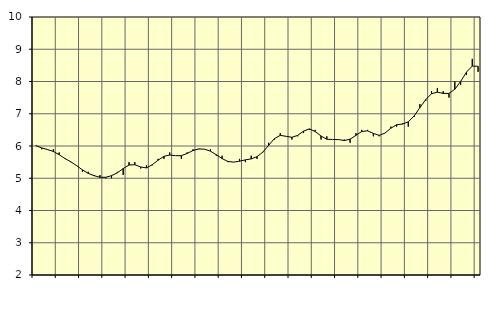
| Category | Piggar | Information och kommunikation, SNI 58-63 |
|---|---|---|
| nan | 6 | 6.01 |
| 1.0 | 5.9 | 5.94 |
| 1.0 | 5.9 | 5.89 |
| 1.0 | 5.9 | 5.83 |
| nan | 5.8 | 5.73 |
| 2.0 | 5.6 | 5.61 |
| 2.0 | 5.5 | 5.51 |
| 2.0 | 5.4 | 5.39 |
| nan | 5.2 | 5.26 |
| 3.0 | 5.2 | 5.15 |
| 3.0 | 5.1 | 5.08 |
| 3.0 | 5.1 | 5.03 |
| nan | 5 | 5.03 |
| 4.0 | 5 | 5.08 |
| 4.0 | 5.2 | 5.17 |
| 4.0 | 5.1 | 5.3 |
| nan | 5.5 | 5.41 |
| 5.0 | 5.5 | 5.42 |
| 5.0 | 5.3 | 5.35 |
| 5.0 | 5.4 | 5.32 |
| nan | 5.4 | 5.42 |
| 6.0 | 5.6 | 5.56 |
| 6.0 | 5.6 | 5.68 |
| 6.0 | 5.8 | 5.72 |
| nan | 5.7 | 5.7 |
| 7.0 | 5.6 | 5.7 |
| 7.0 | 5.8 | 5.77 |
| 7.0 | 5.9 | 5.86 |
| nan | 5.9 | 5.91 |
| 8.0 | 5.9 | 5.9 |
| 8.0 | 5.9 | 5.84 |
| 8.0 | 5.7 | 5.73 |
| nan | 5.7 | 5.61 |
| 9.0 | 5.5 | 5.52 |
| 9.0 | 5.5 | 5.5 |
| 9.0 | 5.6 | 5.53 |
| nan | 5.5 | 5.57 |
| 10.0 | 5.7 | 5.6 |
| 10.0 | 5.6 | 5.67 |
| 10.0 | 5.8 | 5.81 |
| nan | 6.1 | 6.02 |
| 11.0 | 6.2 | 6.23 |
| 11.0 | 6.4 | 6.33 |
| 11.0 | 6.3 | 6.3 |
| nan | 6.2 | 6.27 |
| 12.0 | 6.3 | 6.33 |
| 12.0 | 6.4 | 6.46 |
| 12.0 | 6.5 | 6.53 |
| nan | 6.5 | 6.45 |
| 13.0 | 6.2 | 6.31 |
| 13.0 | 6.3 | 6.21 |
| 13.0 | 6.2 | 6.2 |
| nan | 6.2 | 6.2 |
| 14.0 | 6.2 | 6.17 |
| 14.0 | 6.1 | 6.21 |
| 14.0 | 6.4 | 6.33 |
| nan | 6.5 | 6.45 |
| 15.0 | 6.5 | 6.47 |
| 15.0 | 6.3 | 6.39 |
| 15.0 | 6.3 | 6.33 |
| nan | 6.4 | 6.4 |
| 16.0 | 6.6 | 6.55 |
| 16.0 | 6.6 | 6.66 |
| 16.0 | 6.7 | 6.68 |
| nan | 6.6 | 6.75 |
| 17.0 | 6.9 | 6.93 |
| 17.0 | 7.3 | 7.19 |
| 17.0 | 7.4 | 7.44 |
| nan | 7.7 | 7.62 |
| 18.0 | 7.8 | 7.67 |
| 18.0 | 7.7 | 7.63 |
| 18.0 | 7.5 | 7.63 |
| nan | 8 | 7.76 |
| 19.0 | 7.9 | 8 |
| 19.0 | 8.2 | 8.29 |
| 19.0 | 8.7 | 8.48 |
| nan | 8.3 | 8.47 |